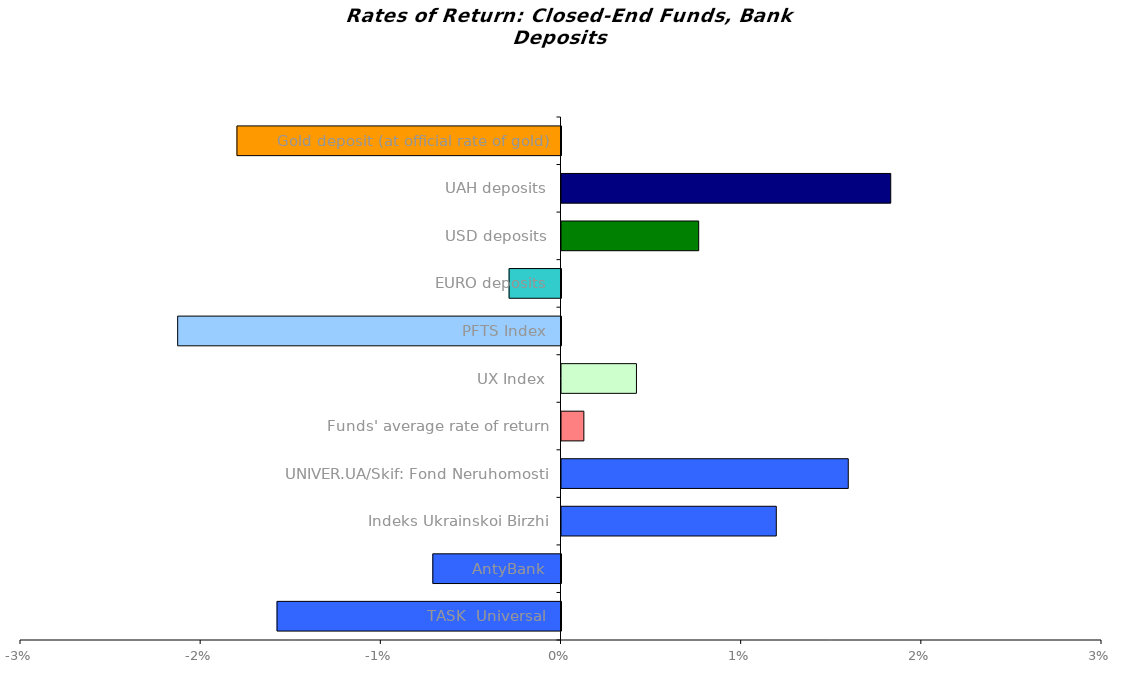
| Category | Series 0 |
|---|---|
| TASK  Universal | -0.016 |
| AntyBank | -0.007 |
| Indeks Ukrainskoi Birzhi | 0.012 |
| UNIVER.UA/Skif: Fond Neruhomosti | 0.016 |
| Funds' average rate of return | 0.001 |
| UX Index | 0.004 |
| PFTS Index | -0.021 |
| EURO deposits | -0.003 |
| USD deposits | 0.008 |
| UAH deposits | 0.018 |
| Gold deposit (at official rate of gold) | -0.018 |